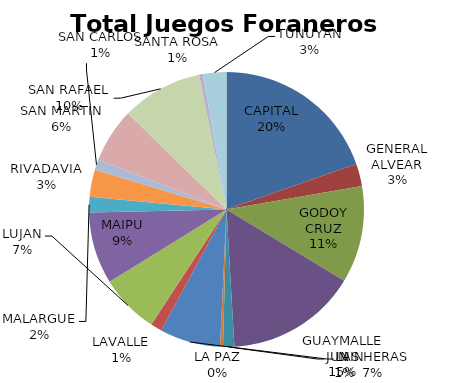
| Category | Total Juegos Foraneros Beneficio |
|---|---|
| CAPITAL | 827258.31 |
| GENERAL ALVEAR | 110194.79 |
| GODOY CRUZ | 479910.7 |
| GUAYMALLEN | 649749.02 |
| JUNIN | 55471.13 |
| LA PAZ | 14765.89 |
| LAS HERAS | 299727.99 |
| LAVALLE | 56369.18 |
| LUJAN | 294114.79 |
| MAIPU | 356343.38 |
| MALARGUE | 77042.63 |
| RIVADAVIA | 134212.75 |
| SAN CARLOS | 50885.2 |
| SAN MARTIN | 270072.37 |
| SAN RAFAEL  | 400651.8 |
| SANTA ROSA | 18660.92 |
| TUNUYAN | 115885.35 |